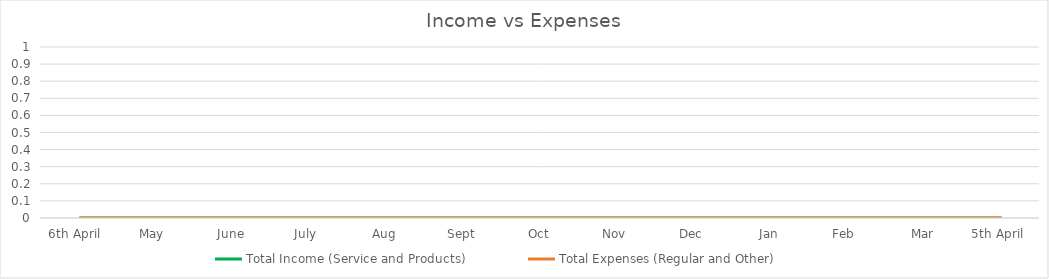
| Category | Total Income (Service and Products) | Total Expenses (Regular and Other) |
|---|---|---|
| 6th April  | 0 | 0 |
| May  | 0 | 0 |
| June | 0 | 0 |
| July  | 0 | 0 |
| Aug | 0 | 0 |
| Sept | 0 | 0 |
| Oct | 0 | 0 |
| Nov | 0 | 0 |
| Dec | 0 | 0 |
| Jan | 0 | 0 |
| Feb  | 0 | 0 |
| Mar | 0 | 0 |
| 5th April  | 0 | 0 |